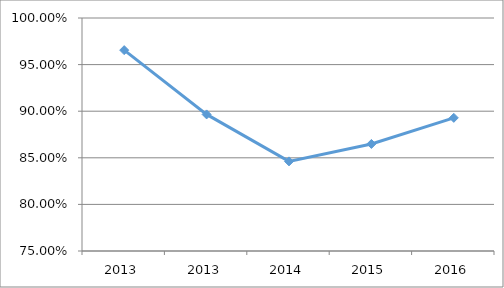
| Category | SIDI-K5O10 |
|---|---|
| 2013.0 | 0.966 |
| 2013.0 | 0.897 |
| 2014.0 | 0.846 |
| 2015.0 | 0.865 |
| 2016.0 | 0.893 |